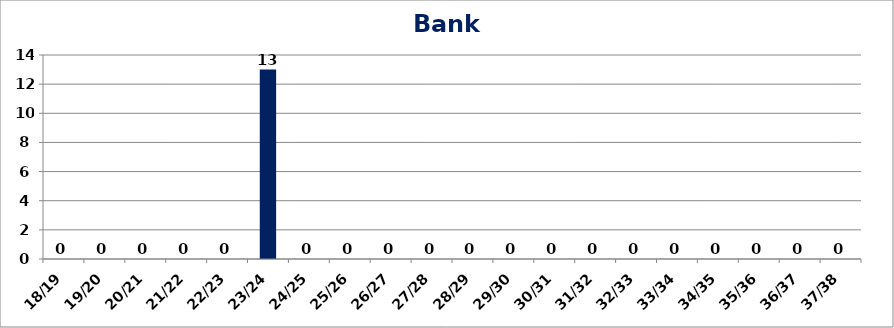
| Category | Bank Quay |
|---|---|
| 18/19 | 0 |
| 19/20 | 0 |
| 20/21 | 0 |
| 21/22 | 0 |
| 22/23 | 0 |
| 23/24 | 13 |
| 24/25 | 0 |
| 25/26 | 0 |
| 26/27 | 0 |
| 27/28 | 0 |
| 28/29 | 0 |
| 29/30 | 0 |
| 30/31 | 0 |
| 31/32 | 0 |
| 32/33 | 0 |
| 33/34 | 0 |
| 34/35 | 0 |
| 35/36 | 0 |
| 36/37 | 0 |
| 37/38 | 0 |